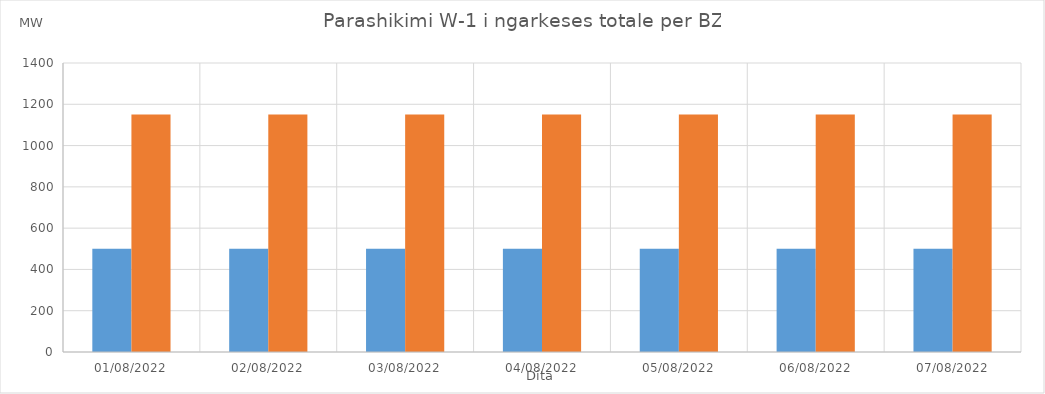
| Category | Min (MW) | Max (MW) |
|---|---|---|
| 01/08/2022 | 500 | 1150 |
| 02/08/2022 | 500 | 1150 |
| 03/08/2022 | 500 | 1150 |
| 04/08/2022 | 500 | 1150 |
| 05/08/2022 | 500 | 1150 |
| 06/08/2022 | 500 | 1150 |
| 07/08/2022 | 500 | 1150 |